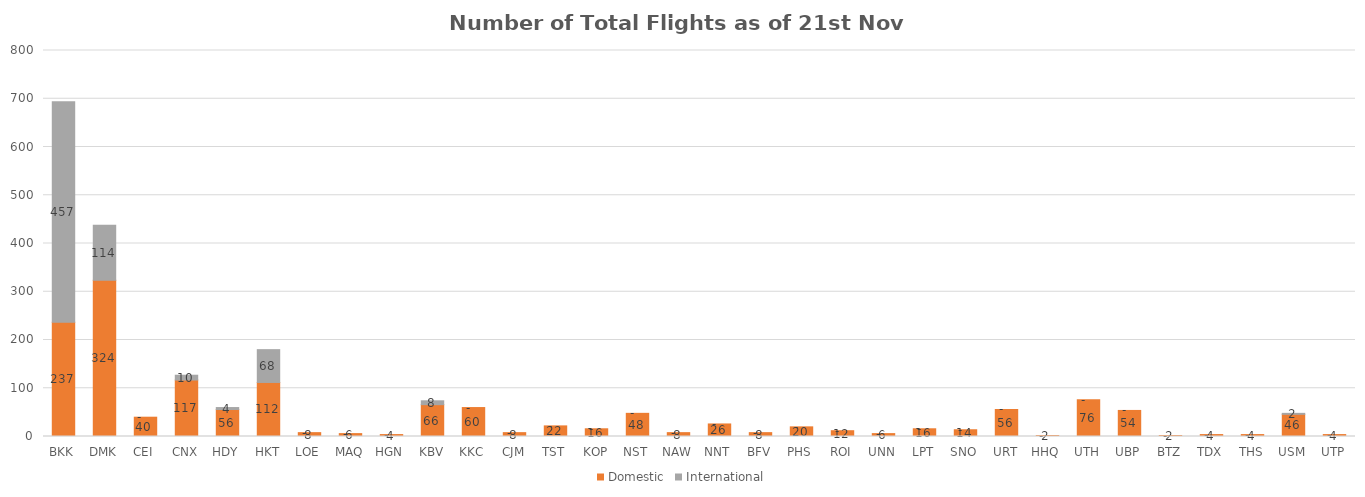
| Category | Domestic | International |
|---|---|---|
| BKK | 237 | 457 |
| DMK | 324 | 114 |
| CEI | 40 | 0 |
| CNX | 117 | 10 |
| HDY | 56 | 4 |
| HKT | 112 | 68 |
| LOE | 8 | 0 |
| MAQ | 6 | 0 |
| HGN | 4 | 0 |
| KBV | 66 | 8 |
| KKC | 60 | 0 |
| CJM | 8 | 0 |
| TST | 22 | 0 |
| KOP | 16 | 0 |
| NST | 48 | 0 |
| NAW | 8 | 0 |
| NNT | 26 | 0 |
| BFV | 8 | 0 |
| PHS | 20 | 0 |
| ROI | 12 | 0 |
| UNN | 6 | 0 |
| LPT | 16 | 0 |
| SNO | 14 | 0 |
| URT | 56 | 0 |
| HHQ | 2 | 0 |
| UTH | 76 | 0 |
| UBP | 54 | 0 |
| BTZ | 2 | 0 |
| TDX | 4 | 0 |
| THS | 4 | 0 |
| USM | 46 | 2 |
| UTP | 4 | 0 |